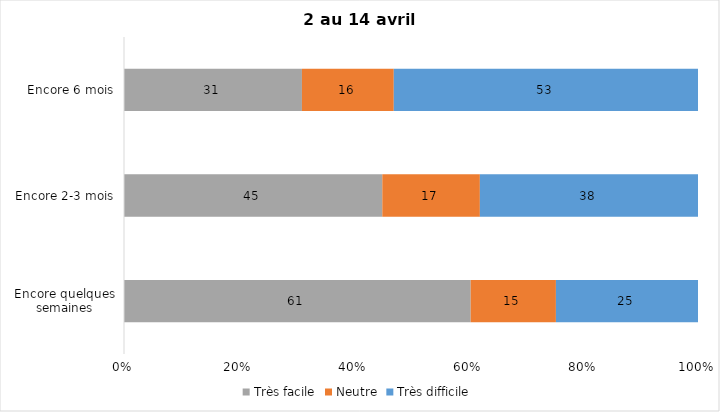
| Category | Très facile | Neutre | Très difficile |
|---|---|---|---|
| Encore quelques semaines | 61 | 15 | 25 |
| Encore 2-3 mois | 45 | 17 | 38 |
| Encore 6 mois | 31 | 16 | 53 |